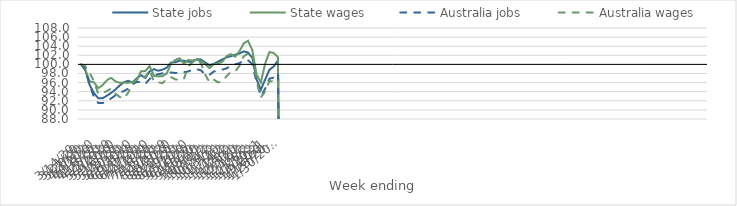
| Category | State jobs | State wages | Australia jobs | Australia wages |
|---|---|---|---|---|
| 14/03/2020 | 100 | 100 | 100 | 100 |
| 21/03/2020 | 98.65 | 98.809 | 98.956 | 99.595 |
| 28/03/2020 | 95.434 | 96.264 | 95.413 | 98.12 |
| 04/04/2020 | 93.679 | 96.068 | 92.814 | 96.244 |
| 11/04/2020 | 92.561 | 94.795 | 91.522 | 93.536 |
| 18/04/2020 | 92.549 | 95.408 | 91.5 | 93.735 |
| 25/04/2020 | 93.11 | 96.518 | 92.025 | 94.14 |
| 02/05/2020 | 93.734 | 97.069 | 92.519 | 94.693 |
| 09/05/2020 | 94.462 | 96.262 | 93.198 | 93.616 |
| 16/05/2020 | 95.358 | 95.96 | 93.788 | 92.845 |
| 23/05/2020 | 96.083 | 96.01 | 94.146 | 92.504 |
| 30/05/2020 | 96.393 | 95.958 | 94.65 | 93.808 |
| 06/06/2020 | 95.989 | 96.154 | 95.634 | 95.987 |
| 13/06/2020 | 96.942 | 96.545 | 96.135 | 96.641 |
| 20/06/2020 | 97.641 | 98.52 | 96.154 | 97.544 |
| 27/06/2020 | 97.021 | 98.522 | 95.728 | 97.236 |
| 04/07/2020 | 98.462 | 99.642 | 96.767 | 98.815 |
| 11/07/2020 | 98.959 | 97.513 | 97.729 | 96.243 |
| 18/07/2020 | 98.606 | 97.353 | 97.82 | 96.079 |
| 25/07/2020 | 98.838 | 97.413 | 98.028 | 95.887 |
| 01/08/2020 | 99.285 | 98.008 | 98.238 | 96.723 |
| 08/08/2020 | 100.413 | 100.17 | 98.223 | 97.204 |
| 15/08/2020 | 100.466 | 100.967 | 98.112 | 96.712 |
| 22/08/2020 | 100.823 | 101.352 | 98.158 | 96.554 |
| 29/08/2020 | 100.783 | 100.182 | 98.287 | 96.77 |
| 05/09/2020 | 100.597 | 100.96 | 98.443 | 99.477 |
| 12/09/2020 | 100.575 | 100.856 | 98.829 | 100.444 |
| 19/09/2020 | 101.146 | 101.032 | 98.97 | 101.162 |
| 26/09/2020 | 101.069 | 100.716 | 98.7 | 100.248 |
| 03/10/2020 | 100.429 | 100.035 | 97.765 | 97.757 |
| 10/10/2020 | 99.816 | 99.186 | 97.711 | 96.071 |
| 17/10/2020 | 100.12 | 100.062 | 98.435 | 96.645 |
| 24/10/2020 | 100.605 | 100.186 | 98.68 | 96.08 |
| 31/10/2020 | 101.078 | 100.583 | 98.863 | 96.206 |
| 07/11/2020 | 101.561 | 101.811 | 99.129 | 97.432 |
| 14/11/2020 | 101.803 | 102.257 | 99.776 | 98.33 |
| 21/11/2020 | 102.139 | 101.703 | 100.039 | 98.416 |
| 28/11/2020 | 102.386 | 102.894 | 100.264 | 99.694 |
| 05/12/2020 | 102.855 | 104.62 | 100.878 | 101.784 |
| 12/12/2020 | 102.606 | 105.194 | 100.916 | 102.402 |
| 19/12/2020 | 101.45 | 103.142 | 100.035 | 102.249 |
| 26/12/2020 | 96.688 | 97.762 | 96.089 | 96.528 |
| 02/01/2021 | 94.445 | 96.013 | 92.998 | 92.765 |
| 09/01/2021 | 96.654 | 100.147 | 94.651 | 94.062 |
| 16/01/2021 | 98.82 | 102.706 | 96.853 | 96.284 |
| 23/01/2021 | 99.543 | 102.526 | 97.109 | 96.336 |
| 30/01/2021 | 100.824 | 101.574 | 98.068 | 96.635 |